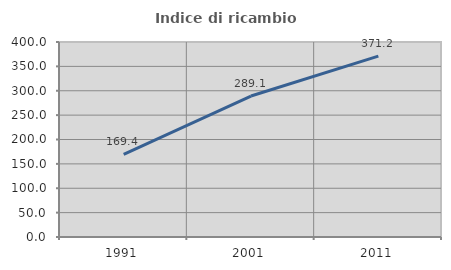
| Category | Indice di ricambio occupazionale  |
|---|---|
| 1991.0 | 169.388 |
| 2001.0 | 289.13 |
| 2011.0 | 371.154 |